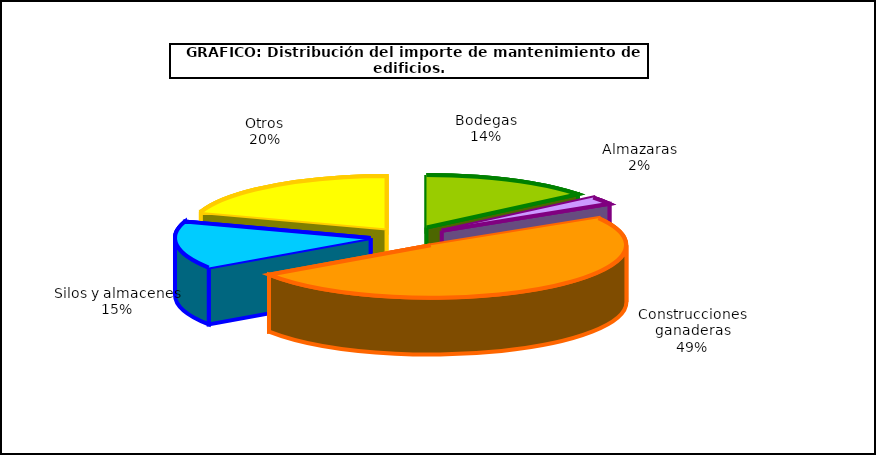
| Category | Series 0 |
|---|---|
| 0 | 72.823 |
| 1 | 11.859 |
| 2 | 253.994 |
| 3 | 75.38 |
| 4 | 102.923 |